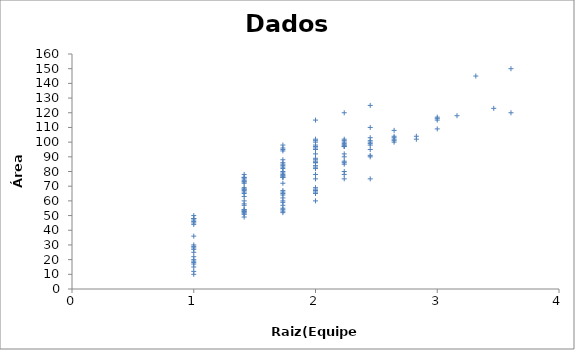
| Category | Series 0 |
|---|---|
| 1.0 | 10 |
| 1.0 | 12 |
| 1.0 | 15 |
| 1.0 | 17 |
| 1.0 | 18 |
| 1.0 | 19 |
| 1.0 | 20 |
| 1.0 | 22 |
| 1.0 | 25 |
| 1.0 | 27 |
| 1.0 | 28 |
| 1.0 | 29 |
| 1.0 | 30 |
| 1.0 | 36 |
| 1.0 | 44 |
| 1.0 | 45 |
| 1.0 | 46 |
| 1.0 | 47 |
| 1.0 | 48 |
| 1.0 | 48 |
| 1.0 | 50 |
| 1.4142135623730951 | 49 |
| 1.4142135623730951 | 51 |
| 1.4142135623730951 | 51 |
| 1.4142135623730951 | 52 |
| 1.4142135623730951 | 53 |
| 1.4142135623730951 | 53 |
| 1.4142135623730951 | 53 |
| 1.4142135623730951 | 54 |
| 1.4142135623730951 | 54 |
| 1.4142135623730951 | 57 |
| 1.4142135623730951 | 58 |
| 1.4142135623730951 | 60 |
| 1.4142135623730951 | 63 |
| 1.4142135623730951 | 65 |
| 1.4142135623730951 | 66 |
| 1.4142135623730951 | 67 |
| 1.4142135623730951 | 68 |
| 1.4142135623730951 | 68 |
| 1.4142135623730951 | 69 |
| 1.4142135623730951 | 72 |
| 1.4142135623730951 | 73 |
| 1.4142135623730951 | 73 |
| 1.4142135623730951 | 74 |
| 1.4142135623730951 | 75 |
| 1.4142135623730951 | 76 |
| 1.4142135623730951 | 76 |
| 1.4142135623730951 | 78 |
| 1.7320508075688772 | 52 |
| 1.7320508075688772 | 53 |
| 1.7320508075688772 | 54 |
| 1.7320508075688772 | 55 |
| 1.7320508075688772 | 57 |
| 1.7320508075688772 | 59 |
| 1.7320508075688772 | 60 |
| 1.7320508075688772 | 62 |
| 1.7320508075688772 | 64 |
| 1.7320508075688772 | 65 |
| 1.7320508075688772 | 66 |
| 1.7320508075688772 | 67 |
| 1.7320508075688772 | 72 |
| 1.7320508075688772 | 76 |
| 1.7320508075688772 | 76 |
| 1.7320508075688772 | 77 |
| 1.7320508075688772 | 77 |
| 1.7320508075688772 | 78 |
| 1.7320508075688772 | 79 |
| 1.7320508075688772 | 80 |
| 1.7320508075688772 | 82 |
| 1.7320508075688772 | 83 |
| 1.7320508075688772 | 84 |
| 1.7320508075688772 | 85 |
| 1.7320508075688772 | 86 |
| 1.7320508075688772 | 88 |
| 1.7320508075688772 | 94 |
| 1.7320508075688772 | 95 |
| 1.7320508075688772 | 96 |
| 1.7320508075688772 | 98 |
| 2.0 | 60 |
| 2.0 | 65 |
| 2.0 | 66 |
| 2.0 | 67 |
| 2.0 | 67 |
| 2.0 | 68 |
| 2.0 | 69 |
| 2.0 | 75 |
| 2.0 | 78 |
| 2.0 | 82 |
| 2.0 | 83 |
| 2.0 | 84 |
| 2.0 | 86 |
| 2.0 | 86 |
| 2.0 | 87 |
| 2.0 | 88 |
| 2.0 | 89 |
| 2.0 | 92 |
| 2.0 | 95 |
| 2.0 | 96 |
| 2.0 | 97 |
| 2.0 | 98 |
| 2.0 | 100 |
| 2.0 | 101 |
| 2.0 | 102 |
| 2.0 | 115 |
| 2.23606797749979 | 75 |
| 2.23606797749979 | 78 |
| 2.23606797749979 | 80 |
| 2.23606797749979 | 85 |
| 2.23606797749979 | 86 |
| 2.23606797749979 | 87 |
| 2.23606797749979 | 90 |
| 2.23606797749979 | 92 |
| 2.23606797749979 | 97 |
| 2.23606797749979 | 97 |
| 2.23606797749979 | 98 |
| 2.23606797749979 | 98 |
| 2.23606797749979 | 99 |
| 2.23606797749979 | 100 |
| 2.23606797749979 | 101 |
| 2.23606797749979 | 102 |
| 2.23606797749979 | 120 |
| 2.449489742783178 | 75 |
| 2.449489742783178 | 90 |
| 2.449489742783178 | 91 |
| 2.449489742783178 | 95 |
| 2.449489742783178 | 98 |
| 2.449489742783178 | 99 |
| 2.449489742783178 | 100 |
| 2.449489742783178 | 101 |
| 2.449489742783178 | 103 |
| 2.449489742783178 | 110 |
| 2.449489742783178 | 125 |
| 2.6457513110645907 | 100 |
| 2.6457513110645907 | 101 |
| 2.6457513110645907 | 102 |
| 2.6457513110645907 | 103 |
| 2.6457513110645907 | 104 |
| 2.6457513110645907 | 108 |
| 2.8284271247461903 | 102 |
| 2.8284271247461903 | 104 |
| 3.0 | 109 |
| 3.0 | 115 |
| 3.0 | 116 |
| 3.0 | 117 |
| 3.1622776601683795 | 118 |
| 3.3166247903554 | 145 |
| 3.4641016151377544 | 123 |
| 3.605551275463989 | 120 |
| 3.605551275463989 | 150 |
| 4.123105625617661 | 125 |